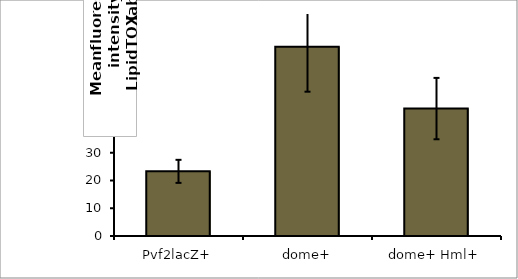
| Category | Series 0 |
|---|---|
| Pvf2lacZ+ | 23.296 |
| dome+ | 68.201 |
| dome+ Hml+ | 45.918 |